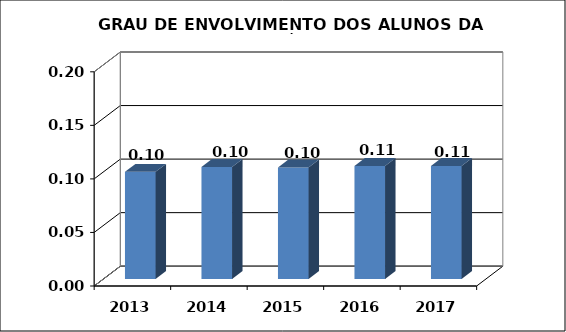
| Category | Series 0 |
|---|---|
| 2013 | 0.1 |
| 2014 | 0.105 |
| 2015 | 0.104 |
| 2016 | 0.106 |
| 2017 | 0.105 |